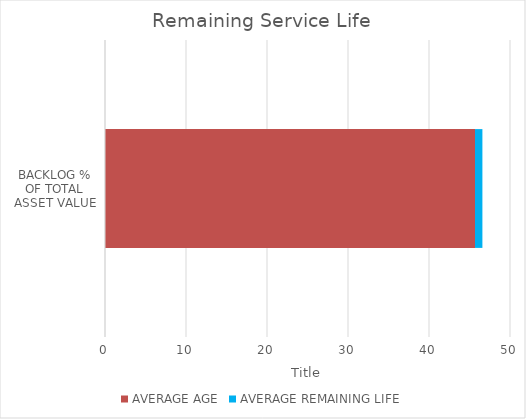
| Category | AVERAGE AGE | AVERAGE REMAINING LIFE |
|---|---|---|
| BACKLOG % OF TOTAL ASSET VALUE | 45.68 | 0.913 |